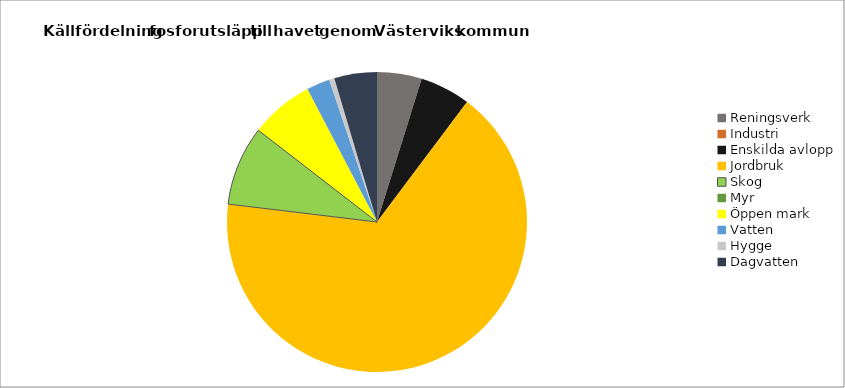
| Category | Series 0 | Series 1 |
|---|---|---|
| Reningsverk | 819.961 | 0.048 |
| Industri | 0 | 0 |
| Enskilda avlopp | 924 | 0.054 |
| Jordbruk | 11341.25 | 0.667 |
| Skog | 1457.25 | 0.086 |
| Myr | 4.25 | 0 |
| Öppen mark | 1162.5 | 0.068 |
| Vatten | 428 | 0.025 |
| Hygge | 95.75 | 0.006 |
| Dagvatten | 782 | 0.046 |